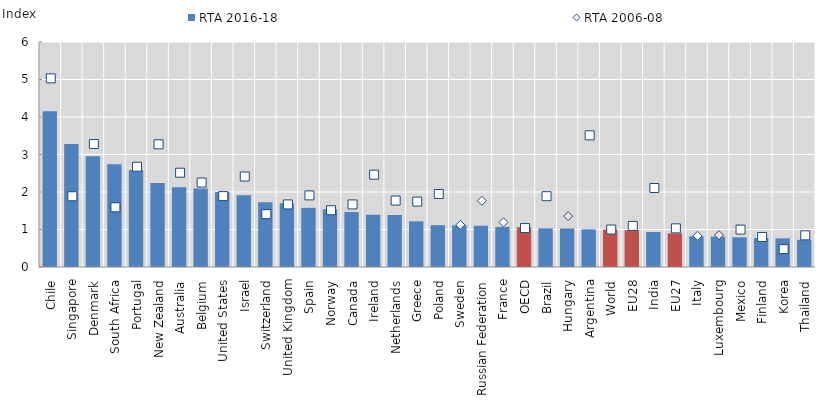
| Category | RTA 2016-18 |
|---|---|
| Chile | 4.153 |
| Singapore | 3.281 |
| Denmark | 2.951 |
| South Africa | 2.738 |
| Portugal | 2.586 |
| New Zealand | 2.239 |
| Australia | 2.127 |
| Belgium | 2.091 |
| United States | 1.998 |
| Israel | 1.914 |
| Switzerland | 1.724 |
| United Kingdom | 1.7 |
| Spain | 1.577 |
| Norway | 1.539 |
| Canada | 1.465 |
| Ireland | 1.393 |
| Netherlands | 1.387 |
| Greece | 1.218 |
| Poland | 1.115 |
| Sweden | 1.111 |
| Russian Federation | 1.099 |
| France | 1.069 |
| OECD | 1.06 |
| Brazil | 1.03 |
| Hungary | 1.026 |
| Argentina | 1.004 |
| World | 1 |
| EU28 | 0.98 |
| India | 0.933 |
| EU27 | 0.897 |
| Italy | 0.821 |
| Luxembourg | 0.809 |
| Mexico | 0.792 |
| Finland | 0.775 |
| Korea | 0.764 |
| Thailand | 0.724 |